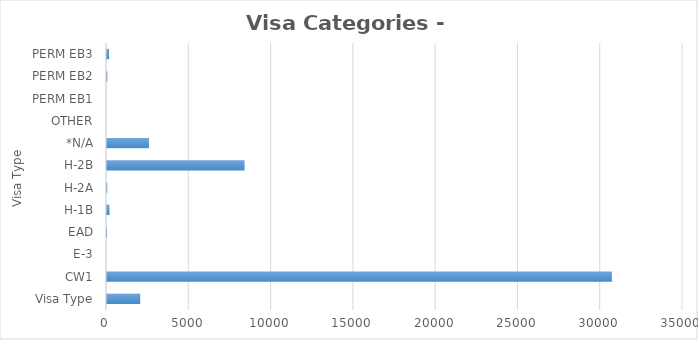
| Category | Series 0 |
|---|---|
| Visa Type | 2018 |
| CW1 | 30678 |
| E-3 | 0 |
| EAD | 4 |
| H-1B | 151 |
| H-2A | 15 |
| H-2B | 8359 |
| *N/A | 2550 |
| OTHER | 0 |
| PERM EB1 | 0 |
| PERM EB2 | 20 |
| PERM EB3 | 125 |